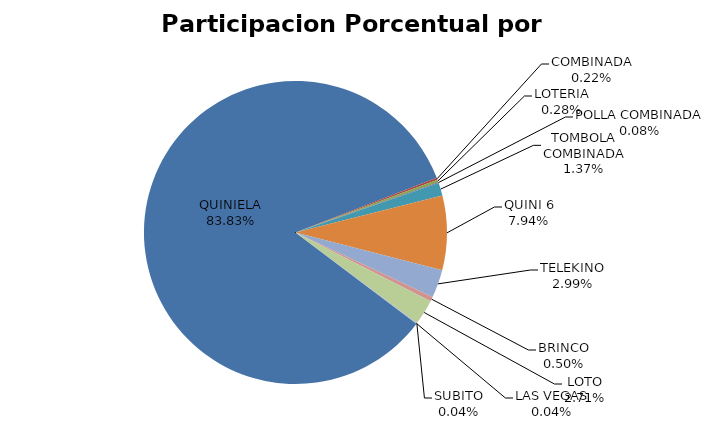
| Category | Series 0 |
|---|---|
| QUINIELA | 22741640.46 |
| COMBINADA | 59216.4 |
| LOTERIA | 77187.6 |
| POLLA COMBINADA | 21456.9 |
| TOMBOLA COMBINADA | 372618 |
| QUINI 6 | 2154148.48 |
| TELEKINO | 812196 |
| BRINCO | 134568 |
| LOTO | 733704.15 |
| SUBITO | 10227 |
| LAS VEGAS | 10093.95 |